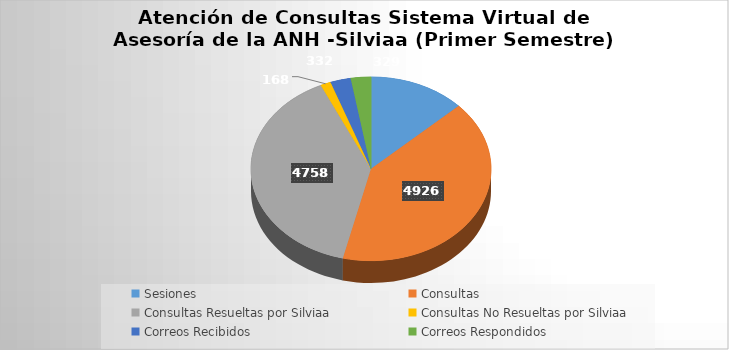
| Category | Total |
|---|---|
| Sesiones | 1570 |
| Consultas | 4926 |
| Consultas Resueltas por Silviaa | 4758 |
| Consultas No Resueltas por Silviaa | 168 |
| Correos Recibidos | 332 |
| Correos Respondidos | 329 |